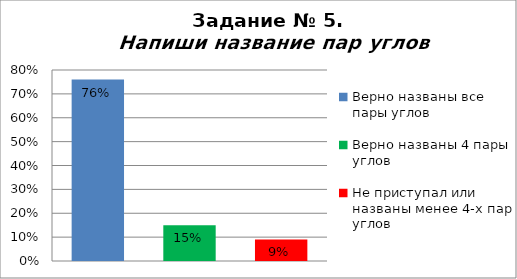
| Category | Напиши название пар углов |
|---|---|
| Верно названы все пары углов | 0.76 |
| Верно названы 4 пары углов | 0.15 |
| Не приступал или названы менее 4-х пар углов | 0.09 |